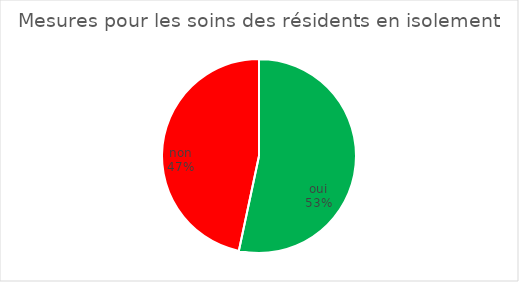
| Category | Mesures pour les soins des résidents en isolement  |
|---|---|
| oui | 8 |
| non | 7 |